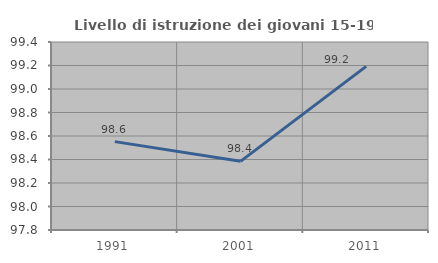
| Category | Livello di istruzione dei giovani 15-19 anni |
|---|---|
| 1991.0 | 98.552 |
| 2001.0 | 98.384 |
| 2011.0 | 99.193 |